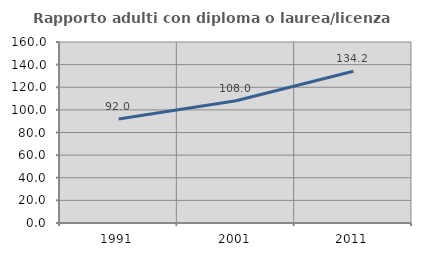
| Category | Rapporto adulti con diploma o laurea/licenza media  |
|---|---|
| 1991.0 | 91.982 |
| 2001.0 | 108.008 |
| 2011.0 | 134.208 |